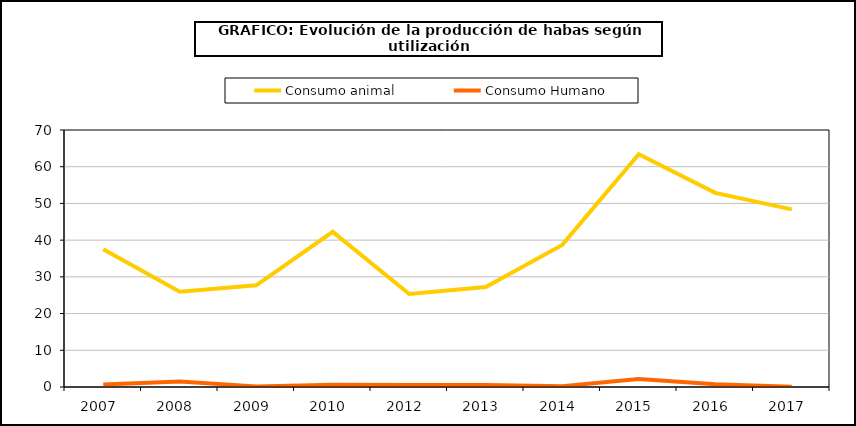
| Category | Consumo animal | Consumo Humano |
|---|---|---|
| 2007  | 37.523 | 0.661 |
| 2008  | 25.955 | 1.505 |
| 2009  | 27.701 | 0.165 |
| 2010  | 42.262 | 0.62 |
| 2012  | 25.317 | 0.571 |
| 2013  | 27.212 | 0.547 |
| 2014  | 38.703 | 0.238 |
| 2015  | 63.379 | 2.153 |
| 2016  | 52.865 | 0.76 |
| 2017  | 48.372 | 0.096 |